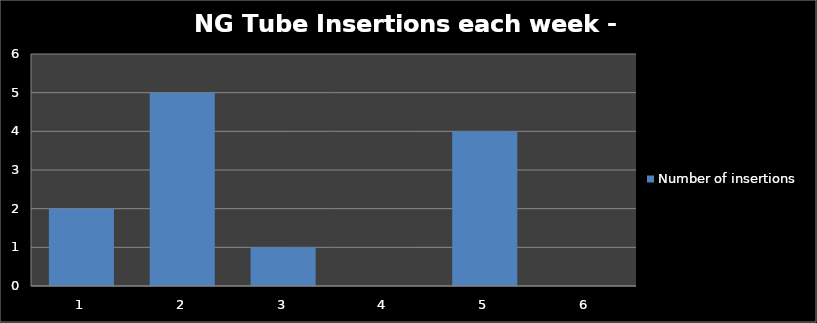
| Category | Number of insertions |
|---|---|
| 0 | 2 |
| 1 | 5 |
| 2 | 1 |
| 3 | 0 |
| 4 | 4 |
| 5 | 0 |